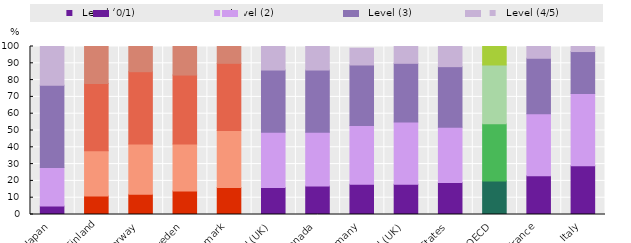
| Category |   Level (0/1) |   Level (2) |   Level (3) |   Level (4/5) |
|---|---|---|---|---|
| Japan | 5 | 23 | 49 | 23 |
| Finland | 11 | 27 | 40 | 22 |
| Norway | 12 | 30 | 43 | 15 |
| Sweden | 14 | 28 | 41 | 17 |
| Denmark | 16 | 34 | 40 | 10 |
| England (UK) | 16 | 33 | 37 | 15 |
| Canada | 17 | 32 | 37 | 14 |
| Germany | 18 | 35 | 36 | 10 |
| N. Ireland (UK) | 18 | 37 | 35 | 10 |
| United States | 19 | 33 | 36 | 13 |
| OECD | 20 | 34 | 35 | 11 |
| France | 23 | 37 | 33 | 7 |
| Italy | 29 | 43 | 25 | 3 |